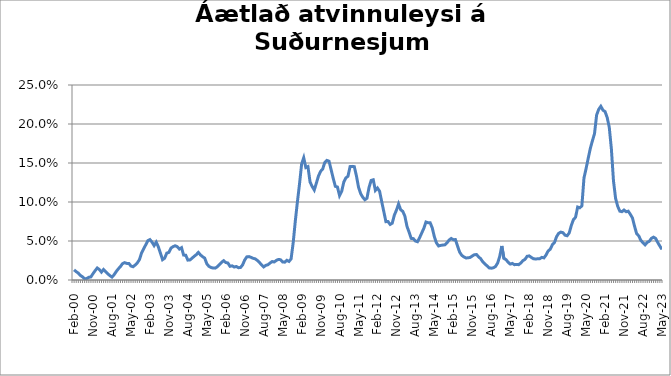
| Category | Series 0 |
|---|---|
| feb.00 | 0.013 |
| mar.00 | 0.011 |
| apr.00 | 0.009 |
| maí.00 | 0.006 |
| jún.00 | 0.004 |
| júl.00 | 0.002 |
| ágú.00 | 0.002 |
| sep.00 | 0.003 |
| okt.00 | 0.004 |
| nóv.00 | 0.008 |
| des.00 | 0.012 |
| jan.01 | 0.015 |
| feb.01 | 0.013 |
| mar.01 | 0.01 |
| apr.01 | 0.013 |
| maí.01 | 0.011 |
| jún.01 | 0.008 |
| júl.01 | 0.006 |
| ágú.01 | 0.004 |
| sep.01 | 0.007 |
| okt.01 | 0.011 |
| nóv.01 | 0.014 |
| des.01 | 0.017 |
| jan.02 | 0.021 |
| feb.02 | 0.022 |
| mar.02 | 0.021 |
| apr.02 | 0.021 |
| maí.02 | 0.018 |
| jún.02 | 0.017 |
| júl.02 | 0.019 |
| ágú.02 | 0.022 |
| sep.02 | 0.026 |
| okt.02 | 0.034 |
| nóv.02 | 0.04 |
| des.02 | 0.045 |
| jan.03 | 0.05 |
| feb.03 | 0.052 |
| mar.03 | 0.049 |
| apr.03 | 0.044 |
| maí.03 | 0.049 |
| jún.03 | 0.043 |
| júl.03 | 0.034 |
| ágú.03 | 0.026 |
| sep.03 | 0.028 |
| okt.03 | 0.034 |
| nóv.03 | 0.035 |
| des.03 | 0.041 |
| jan.04 | 0.043 |
| feb.04 | 0.044 |
| mar.04 | 0.043 |
| apr.04 | 0.04 |
| maí.04 | 0.041 |
| jún.04 | 0.032 |
| júl.04 | 0.032 |
| ágú.04 | 0.026 |
| sep.04 | 0.026 |
| okt.04 | 0.028 |
| nóv.04 | 0.03 |
| des.04 | 0.032 |
| jan.05 | 0.035 |
| feb.05 | 0.032 |
| mar.05 | 0.03 |
| apr.05 | 0.028 |
| maí.05 | 0.021 |
| jún.05 | 0.018 |
| júl.05 | 0.016 |
| ágú.05 | 0.015 |
| sep.05 | 0.015 |
| okt.05 | 0.017 |
| nóv.05 | 0.02 |
| des.05 | 0.023 |
| jan.06 | 0.025 |
| feb.06 | 0.022 |
| mar.06 | 0.022 |
| apr.06 | 0.018 |
| maí.06 | 0.018 |
| jún.06 | 0.017 |
| júl.06 | 0.017 |
| ágú.06 | 0.016 |
| sep.06 | 0.016 |
| okt.06 | 0.019 |
| nóv.06 | 0.026 |
| des.06 | 0.03 |
| jan.07 | 0.03 |
| feb.07 | 0.029 |
| mar.07 | 0.028 |
| apr.07 | 0.027 |
| maí.07 | 0.025 |
| jún.07 | 0.022 |
| júl.07 | 0.019 |
| ágú.07 | 0.017 |
| sep.07 | 0.019 |
| okt.07 | 0.02 |
| nóv.07 | 0.022 |
| des.07 | 0.024 |
| jan.08 | 0.023 |
| feb.08 | 0.025 |
| mar.08 | 0.026 |
| apr.08 | 0.026 |
| maí.08 | 0.023 |
| jún.08 | 0.023 |
| júl.08 | 0.025 |
| ágú.08 | 0.024 |
| sep.08 | 0.027 |
| okt.08 | 0.048 |
| nóv.08 | 0.075 |
| des.08 | 0.1 |
| jan.09 | 0.123 |
| feb.09 | 0.149 |
| mar.09 | 0.157 |
| apr.09 | 0.144 |
| maí.09 | 0.145 |
| jún.09 | 0.126 |
| júl.09 | 0.12 |
| ágú.09 | 0.115 |
| sep.09 | 0.124 |
| okt.09 | 0.133 |
| nóv.09 | 0.139 |
| des.09 | 0.142 |
| jan.10 | 0.151 |
| feb.10 | 0.153 |
| mar.10 | 0.152 |
| apr.10 | 0.141 |
| maí.10 | 0.13 |
| jún.10 | 0.12 |
| júl.10 | 0.119 |
| ágú.10 | 0.108 |
| sep.10 | 0.114 |
| okt.10 | 0.125 |
| nóv.10 | 0.131 |
| des.10 | 0.133 |
| jan.11 | 0.145 |
| feb.11 | 0.146 |
| mar.11 | 0.145 |
| apr.11 | 0.134 |
| maí.11 | 0.119 |
| jún.11 | 0.111 |
| júl.11 | 0.106 |
| ágú.11 | 0.103 |
| sep.11 | 0.105 |
| okt.11 | 0.119 |
| nóv.11 | 0.128 |
| des.11 | 0.128 |
| jan.12 | 0.115 |
| feb.12 | 0.118 |
| mar.12 | 0.114 |
| apr.12 | 0.101 |
| maí.12 | 0.088 |
| jún.12 | 0.075 |
| júl.12 | 0.075 |
| ágú.12 | 0.071 |
| sep.12 | 0.073 |
| okt.12 | 0.083 |
| nóv.12 | 0.09 |
| des.12 | 0.098 |
| jan.13 | 0.09 |
| feb.13 | 0.088 |
| mar.13 | 0.082 |
| apr.13 | 0.069 |
| maí.13 | 0.061 |
| jún.13 | 0.053 |
| júl.13 | 0.053 |
| ágú.13 | 0.05 |
| sep.13 | 0.049 |
| okt.13 | 0.054 |
| nóv.13 | 0.06 |
| des.13 | 0.066 |
| jan.14 | 0.074 |
| feb.14 | 0.073 |
| mar.14 | 0.073 |
| apr.14 | 0.067 |
| maí.14 | 0.055 |
| jún.14 | 0.048 |
| júl.14 | 0.044 |
| ágú.14 | 0.044 |
| sep.14 | 0.045 |
| okt.14 | 0.045 |
| nóv.14*** | 0.048 |
| des.14 | 0.051 |
| jan.15 | 0.053 |
| feb.15 | 0.052 |
| mar.15 | 0.052 |
| apr.15 | 0.044 |
| maí.15 | 0.036 |
| jún.15 | 0.032 |
| júl.15 | 0.03 |
| ágú.15 | 0.028 |
| sep.15 | 0.028 |
| okt.15 | 0.029 |
| nóv.15 | 0.031 |
| des.15 | 0.032 |
| jan.16 | 0.033 |
| feb.16 | 0.03 |
| mar.16 | 0.027 |
| apr.16 | 0.023 |
| maí.16 | 0.02 |
| jún.16 | 0.018 |
| júl.16 | 0.015 |
| ágú.16 | 0.015 |
| sep.16 | 0.016 |
| okt.16 | 0.017 |
| nóv.16 | 0.022 |
| des.16 | 0.03 |
| jan.17 | 0.044 |
| feb.17 | 0.028 |
| mar.17 | 0.026 |
| apr.17 | 0.023 |
| maí.17 | 0.02 |
| jún.17 | 0.021 |
| júl.17 | 0.02 |
| ágú.17 | 0.02 |
| sep.17 | 0.02 |
| okt.17 | 0.022 |
| nóv.17 | 0.025 |
| des.17 | 0.026 |
| jan.18 | 0.03 |
| feb.18 | 0.031 |
| mar.18 | 0.029 |
| apr.18 | 0.027 |
| maí.18 | 0.027 |
| jún.18 | 0.027 |
| júl.18 | 0.027 |
| ágú.18 | 0.029 |
| sep.18 | 0.028 |
| okt.18 | 0.032 |
| nóv.18 | 0.037 |
| des.18 | 0.039 |
| jan.19 | 0.045 |
| feb.19 | 0.048 |
| mar.19 | 0.056 |
| apr.19 | 0.06 |
| maí.19 | 0.061 |
| jún.19 | 0.061 |
| júl.19 | 0.057 |
| ágú.19 | 0.057 |
| sep.19 | 0.06 |
| okt.19 | 0.07 |
| nóv.19 | 0.078 |
| des.19 | 0.08 |
| jan.20 | 0.094 |
| feb.20 | 0.093 |
| mars 2020* | 0.095 |
| apr.20 | 0.131 |
| maí.20 | 0.143 |
| jún.20 | 0.156 |
| júl.20 | 0.169 |
| ágú.20 | 0.178 |
| sep.20 | 0.188 |
| okt.20 | 0.212 |
| nóv.20 | 0.219 |
| des.20 | 0.223 |
| jan.21 | 0.218 |
| feb.21 | 0.216 |
| mar.21 | 0.208 |
| apr.21 | 0.196 |
| maí.21 | 0.168 |
| jún.21 | 0.127 |
| júl.21 | 0.105 |
| ágú.21 | 0.094 |
| sep.21 | 0.088 |
| okt.21 | 0.088 |
| nóv.21 | 0.09 |
| des.21 | 0.088 |
| jan.22 | 0.088 |
| feb.22 | 0.084 |
| mar.22 | 0.08 |
| apr.22 | 0.069 |
| maí.22 | 0.059 |
| jún.22 | 0.057 |
| júl.22 | 0.051 |
| ágú.22 | 0.048 |
| sep.22 | 0.045 |
| okt.22 | 0.048 |
| nóv.22 | 0.05 |
| des.22 | 0.053 |
| jan.23 | 0.055 |
| feb.23 | 0.053 |
| mar.23 | 0.048 |
| apr.23 | 0.044 |
| maí.23 | 0.039 |